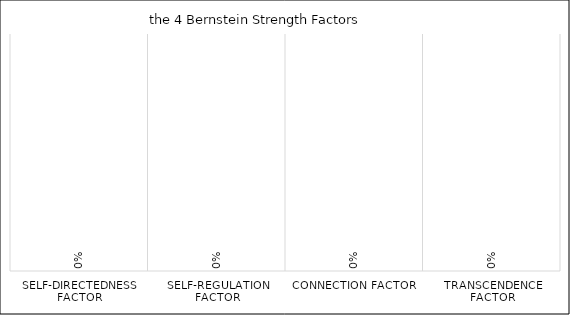
| Category | Series 0 |
|---|---|
| Self-directedness factor | 0 |
| Self-regulation factor | 0 |
| Connection factor | 0 |
| Transcendence factor | 0 |